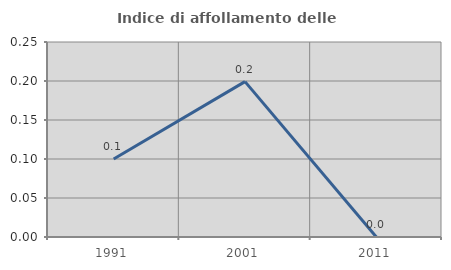
| Category | Indice di affollamento delle abitazioni  |
|---|---|
| 1991.0 | 0.1 |
| 2001.0 | 0.199 |
| 2011.0 | 0 |